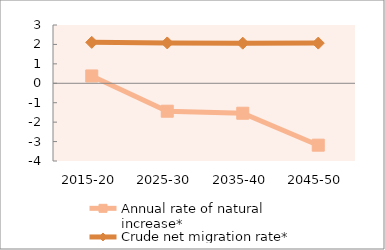
| Category | Annual rate of natural increase* | Crude net migration rate* |
|---|---|---|
| 2015-20 | 0.377 | 2.106 |
| 2025-30 | -1.437 | 2.076 |
| 2035-40 | -1.542 | 2.064 |
| 2045-50 | -3.186 | 2.068 |